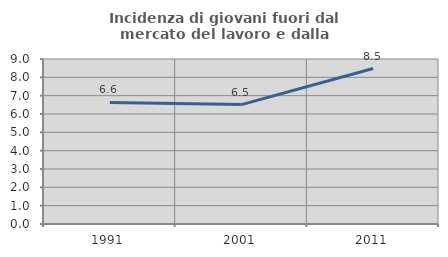
| Category | Incidenza di giovani fuori dal mercato del lavoro e dalla formazione  |
|---|---|
| 1991.0 | 6.631 |
| 2001.0 | 6.513 |
| 2011.0 | 8.482 |